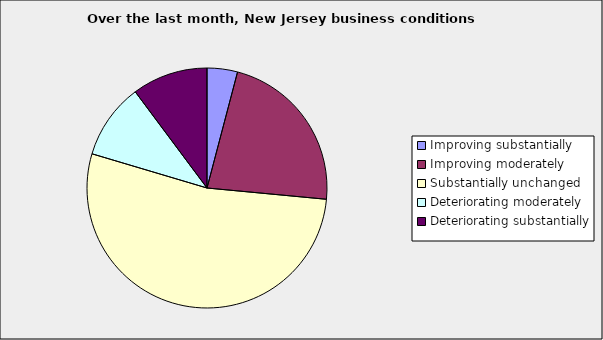
| Category | Series 0 |
|---|---|
| Improving substantially | 0.041 |
| Improving moderately | 0.224 |
| Substantially unchanged | 0.531 |
| Deteriorating moderately | 0.102 |
| Deteriorating substantially | 0.102 |